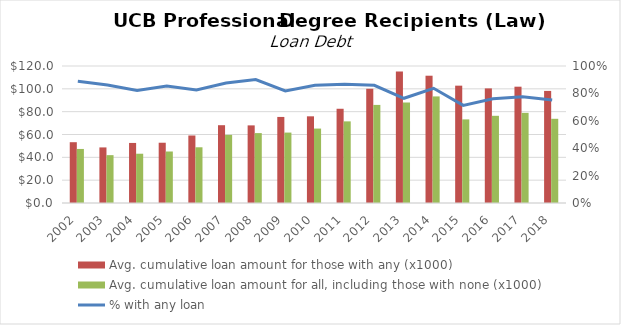
| Category | Avg. cumulative loan amount for those with any (x1000) | Avg. cumulative loan amount for all, including those with none (x1000) |
|---|---|---|
| 2002.0 | 53255.438 | 47338.167 |
| 2003.0 | 48687.523 | 41916.411 |
| 2004.0 | 52604.898 | 43162.994 |
| 2005.0 | 52788.574 | 45110.236 |
| 2006.0 | 59130.46 | 48800.44 |
| 2007.0 | 68143.745 | 59678.683 |
| 2008.0 | 67988.635 | 61229.531 |
| 2009.0 | 75386.509 | 61679.871 |
| 2010.0 | 75919.848 | 65192.043 |
| 2011.0 | 82541.935 | 71504.351 |
| 2012.0 | 100053.292 | 85921.471 |
| 2013.0 | 115128.214 | 88000.301 |
| 2014.0 | 111489.942 | 93356.036 |
| 2015.0 | 102778.789 | 73229.888 |
| 2016.0 | 100379.479 | 76375.69 |
| 2017.0 | 101878.786 | 78971.13 |
| 2018.0 | 98168.338 | 73753.415 |